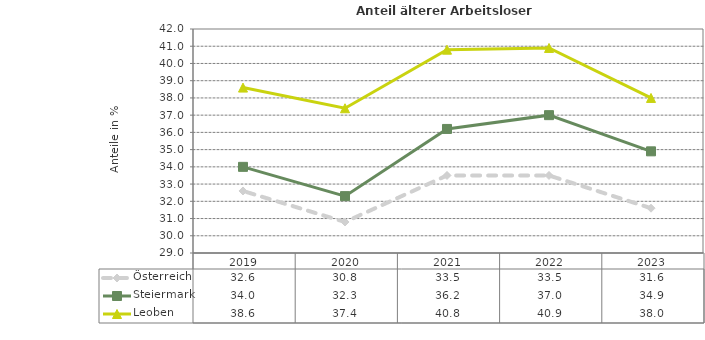
| Category | Österreich | Steiermark | Leoben |
|---|---|---|---|
| 2023.0 | 31.6 | 34.9 | 38 |
| 2022.0 | 33.5 | 37 | 40.9 |
| 2021.0 | 33.5 | 36.2 | 40.8 |
| 2020.0 | 30.8 | 32.3 | 37.4 |
| 2019.0 | 32.6 | 34 | 38.6 |